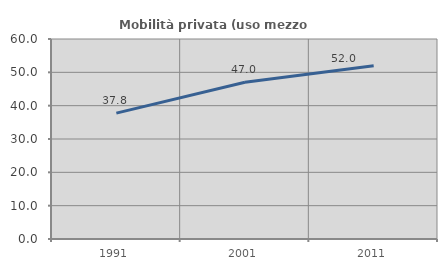
| Category | Mobilità privata (uso mezzo privato) |
|---|---|
| 1991.0 | 37.755 |
| 2001.0 | 47.011 |
| 2011.0 | 51.998 |